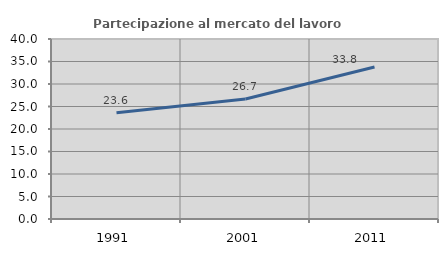
| Category | Partecipazione al mercato del lavoro  femminile |
|---|---|
| 1991.0 | 23.588 |
| 2001.0 | 26.675 |
| 2011.0 | 33.781 |